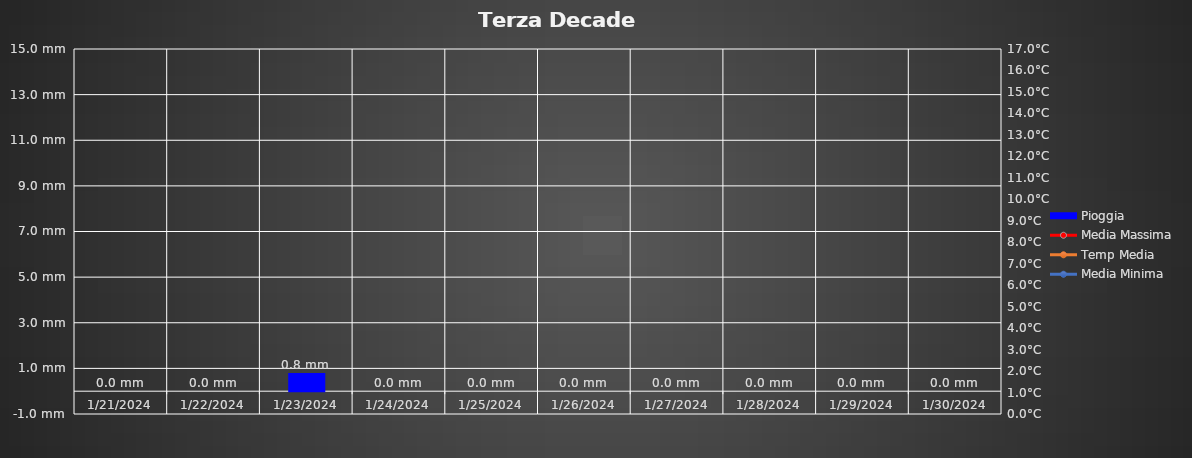
| Category | Pioggia |
|---|---|
| 1/21/24 | 0 |
| 1/22/24 | 0 |
| 1/23/24 | 0.8 |
| 1/24/24 | 0 |
| 1/25/24 | 0 |
| 1/26/24 | 0 |
| 1/27/24 | 0 |
| 1/28/24 | 0 |
| 1/29/24 | 0 |
| 1/30/24 | 0 |